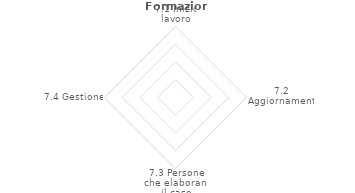
| Category | Series 2 |
|---|---|
| 7.1 Inizio lavoro | 0 |
| 7.2 Aggiornamenti | 0 |
| 7.3 Persone che elaborano il caso | 0 |
| 7.4 Gestione | 0 |